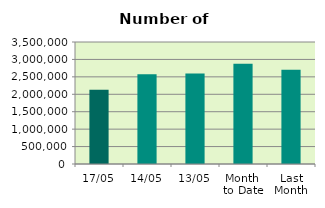
| Category | Series 0 |
|---|---|
| 17/05 | 2127684 |
| 14/05 | 2574282 |
| 13/05 | 2597858 |
| Month 
to Date | 2875279.818 |
| Last
Month | 2707305.9 |